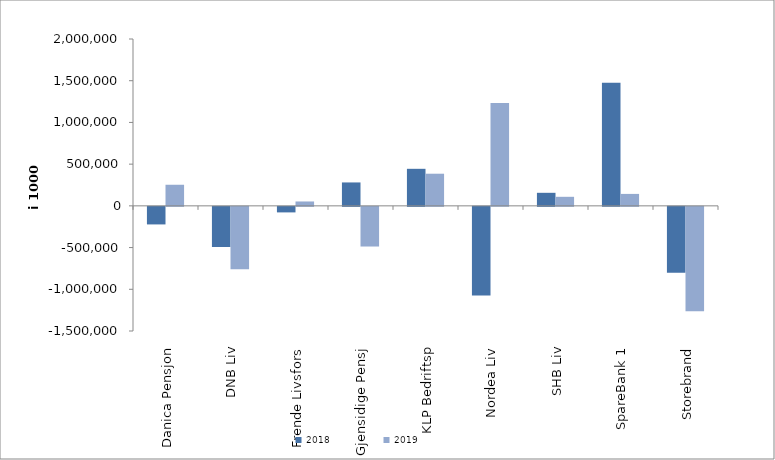
| Category | 2018 | 2019 |
|---|---|---|
| Danica Pensjon | -210577.098 | 252935.324 |
| DNB Liv | -481067 | -747449 |
| Frende Livsfors | -66404 | 52602 |
| Gjensidige Pensj | 280691 | -475395 |
| KLP Bedriftsp | 444032 | 385283 |
| Nordea Liv | -1061165.384 | 1232764.595 |
| SHB Liv | 156380 | 108424.593 |
| SpareBank 1 | 1474548.051 | 143228.919 |
| Storebrand | -788494.157 | -1250440.145 |